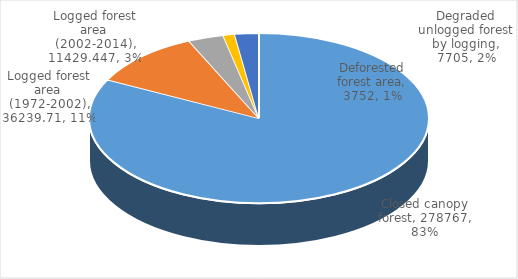
| Category | Size (square kilometer) |
|---|---|
| Closed canopy forest | 278767 |
| Logged forest area (1972-2002) | 36239.71 |
| Logged forest area (2002-2014) | 11429.447 |
| Deforested forest area | 3752 |
| Degraded unlogged forest by logging | 7705 |